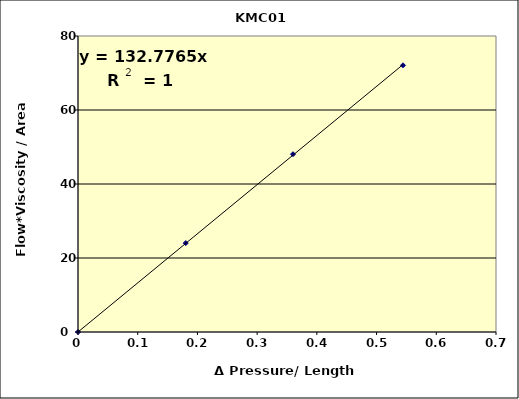
| Category | Series 0 |
|---|---|
| 0.0 | 0 |
| 0.18042188585991198 | 24.026 |
| 0.36002197080855675 | 48.051 |
| 0.5442556181944553 | 72.077 |